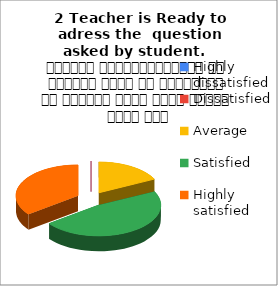
| Category | 2 Teacher is Ready to adress the  question asked by student.   शिक्षक विद्यार्थियों के द्वारा पूछे गए प्रश्नों का समाधान करने हेतु तत्पर रहते हैं |
|---|---|
| Highly dissatisfied | 0 |
| Dissatisfied | 0 |
| Average | 3 |
| Satisfied | 8 |
| Highly satisfied | 6 |